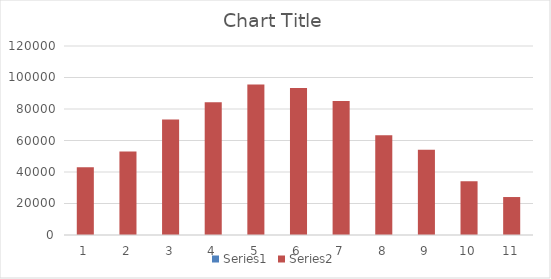
| Category | Series 0 | Series 1 |
|---|---|---|
| 0 | 0.1 | 43013 |
| 1 | 0.15 | 53074 |
| 2 | 0.2 | 73257 |
| 3 | 0.25 | 84311 |
| 4 | 0.3 | 95600 |
| 5 | 0.35 | 93292 |
| 6 | 0.4 | 85028 |
| 7 | 0.45 | 63365 |
| 8 | 0.5 | 54105 |
| 9 | 0.6 | 34105 |
| 10 | 0.7 | 24105 |